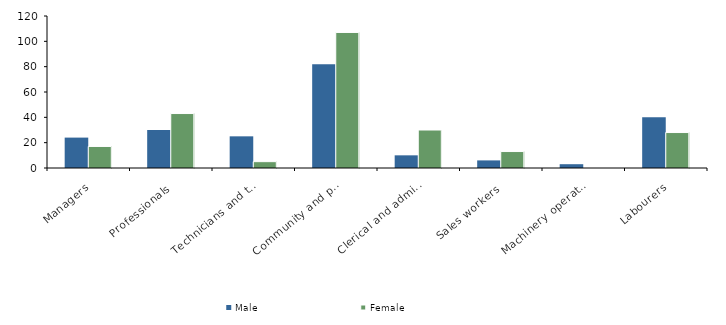
| Category | Male | Female |
|---|---|---|
| Managers | 24 | 17 |
| Professionals | 30 | 43 |
| Technicians and trades workers | 25 | 5 |
| Community and personal service workers | 82 | 107 |
| Clerical and administrative workers | 10 | 30 |
| Sales workers | 6 | 13 |
| Machinery operators and drivers | 3 | 0 |
| Labourers | 40 | 28 |